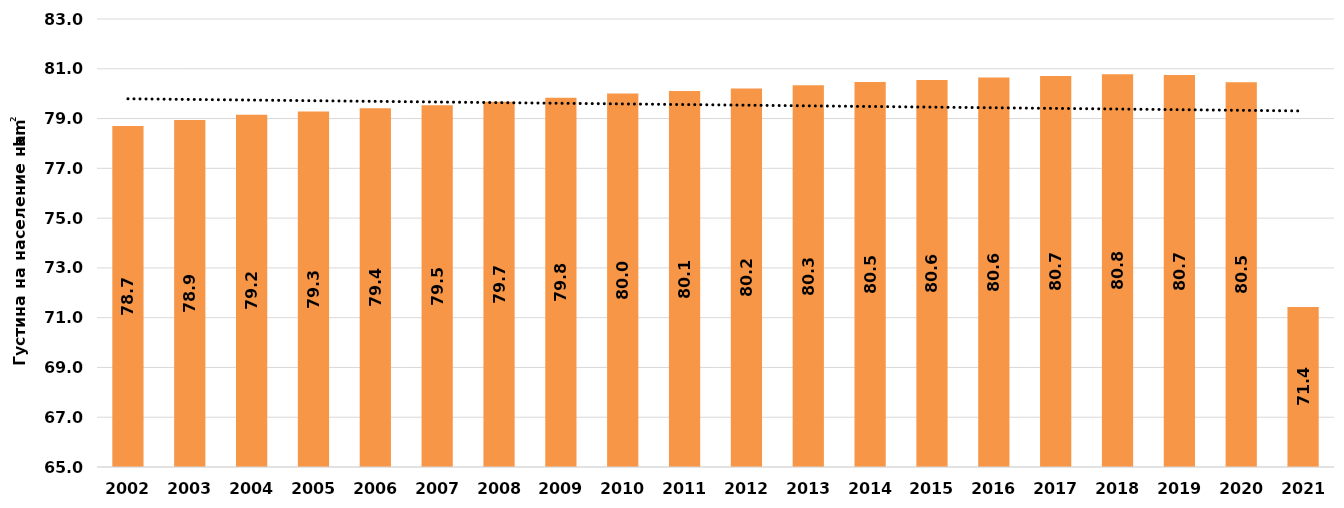
| Category | Густина на население на км2 |
|---|---|
| 2002 | 78.702 |
| 2003 | 78.944 |
| 2004 | 79.15 |
| 2005 | 79.28 |
| 2006 | 79.413 |
| 2007 | 79.539 |
| 2008 | 79.673 |
| 2009 | 79.832 |
| 2010 | 80.009 |
| 2011 | 80.107 |
| 2012 | 80.204 |
| 2013 | 80.339 |
| 2014 | 80.472 |
| 2015 | 80.554 |
| 2016 | 80.648 |
| 2017 | 80.71 |
| 2018 | 80.781 |
| 2019 | 80.747 |
| 2020 | 80.458 |
| 2021 | 71.431 |